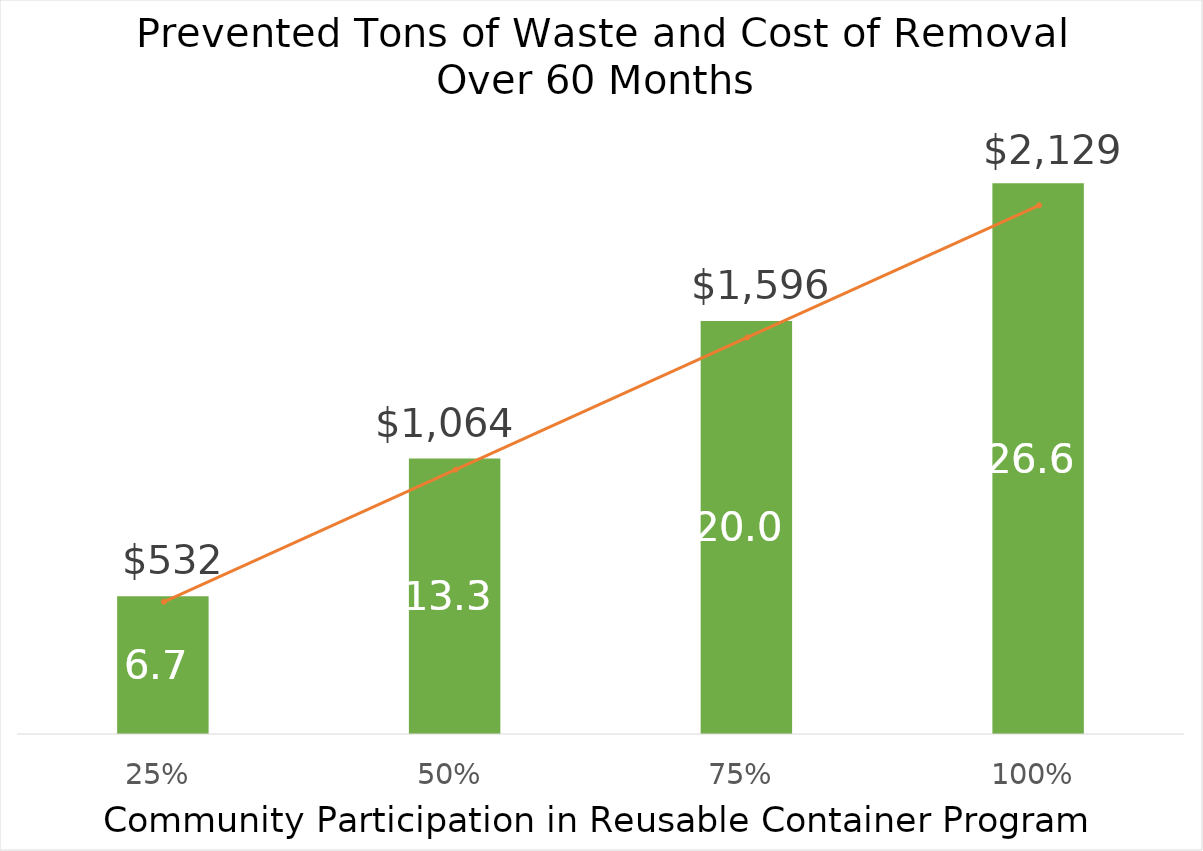
| Category | Series 0 |
|---|---|
| 0.25 | 6.652 |
| 0.5 | 13.304 |
| 0.75 | 19.955 |
| 1.0 | 26.607 |